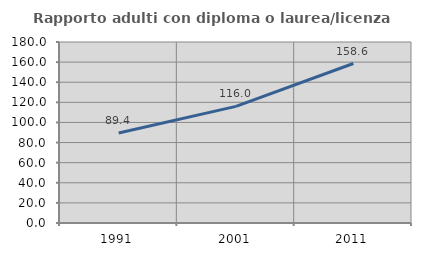
| Category | Rapporto adulti con diploma o laurea/licenza media  |
|---|---|
| 1991.0 | 89.449 |
| 2001.0 | 115.976 |
| 2011.0 | 158.618 |